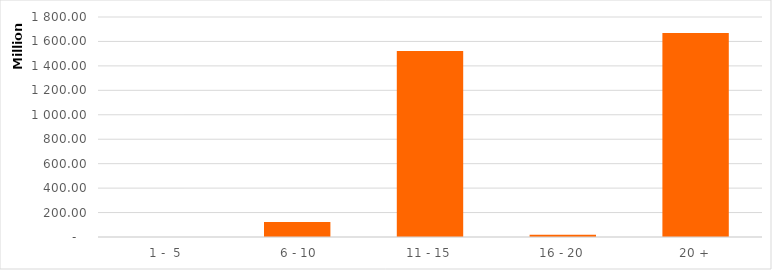
| Category | Series 0 |
|---|---|
|  1 -  5 | 0 |
|  6 - 10 | 122979992.02 |
| 11 - 15 | 1521556557.99 |
| 16 - 20 | 17963354.85 |
| 20 + | 1668713224.21 |